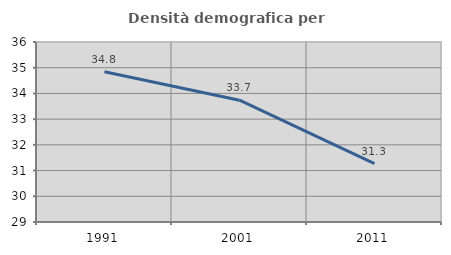
| Category | Densità demografica |
|---|---|
| 1991.0 | 34.844 |
| 2001.0 | 33.736 |
| 2011.0 | 31.269 |